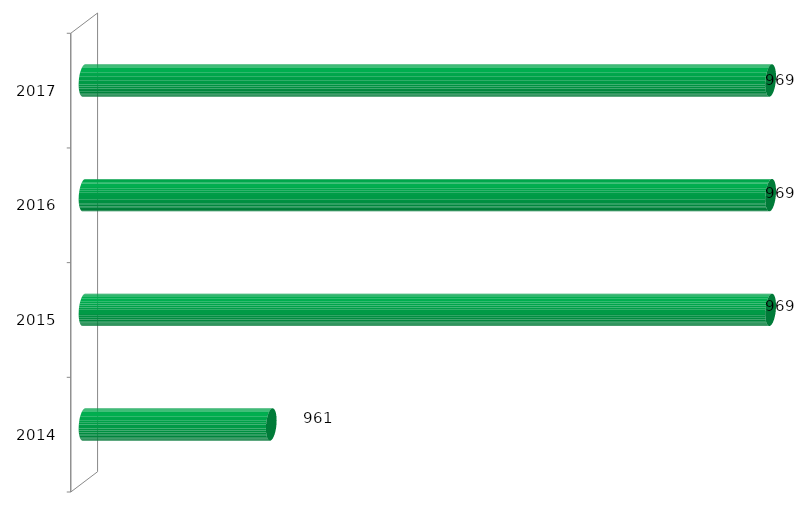
| Category | Vagas ofertadas |
|---|---|
| 2014.0 | 961 |
| 2015.0 | 969 |
| 2016.0 | 969 |
| 2017.0 | 969 |